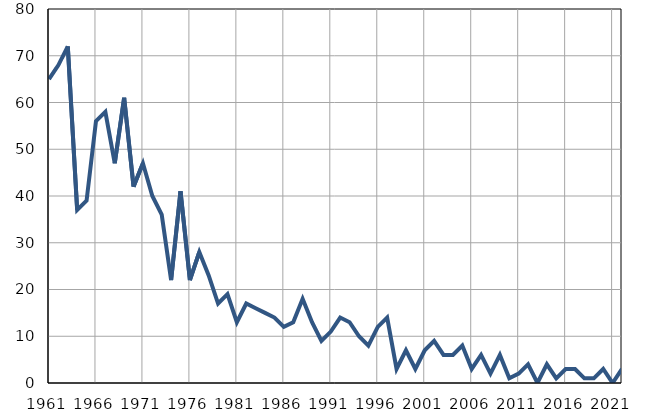
| Category | Умрла 
одојчад |
|---|---|
| 1961.0 | 65 |
| 1962.0 | 68 |
| 1963.0 | 72 |
| 1964.0 | 37 |
| 1965.0 | 39 |
| 1966.0 | 56 |
| 1967.0 | 58 |
| 1968.0 | 47 |
| 1969.0 | 61 |
| 1970.0 | 42 |
| 1971.0 | 47 |
| 1972.0 | 40 |
| 1973.0 | 36 |
| 1974.0 | 22 |
| 1975.0 | 41 |
| 1976.0 | 22 |
| 1977.0 | 28 |
| 1978.0 | 23 |
| 1979.0 | 17 |
| 1980.0 | 19 |
| 1981.0 | 13 |
| 1982.0 | 17 |
| 1983.0 | 16 |
| 1984.0 | 15 |
| 1985.0 | 14 |
| 1986.0 | 12 |
| 1987.0 | 13 |
| 1988.0 | 18 |
| 1989.0 | 13 |
| 1990.0 | 9 |
| 1991.0 | 11 |
| 1992.0 | 14 |
| 1993.0 | 13 |
| 1994.0 | 10 |
| 1995.0 | 8 |
| 1996.0 | 12 |
| 1997.0 | 14 |
| 1998.0 | 3 |
| 1999.0 | 7 |
| 2000.0 | 3 |
| 2001.0 | 7 |
| 2002.0 | 9 |
| 2003.0 | 6 |
| 2004.0 | 6 |
| 2005.0 | 8 |
| 2006.0 | 3 |
| 2007.0 | 6 |
| 2008.0 | 2 |
| 2009.0 | 6 |
| 2010.0 | 1 |
| 2011.0 | 2 |
| 2012.0 | 4 |
| 2013.0 | 0 |
| 2014.0 | 4 |
| 2015.0 | 1 |
| 2016.0 | 3 |
| 2017.0 | 3 |
| 2018.0 | 1 |
| 2019.0 | 1 |
| 2020.0 | 3 |
| 2021.0 | 0 |
| 2022.0 | 3 |